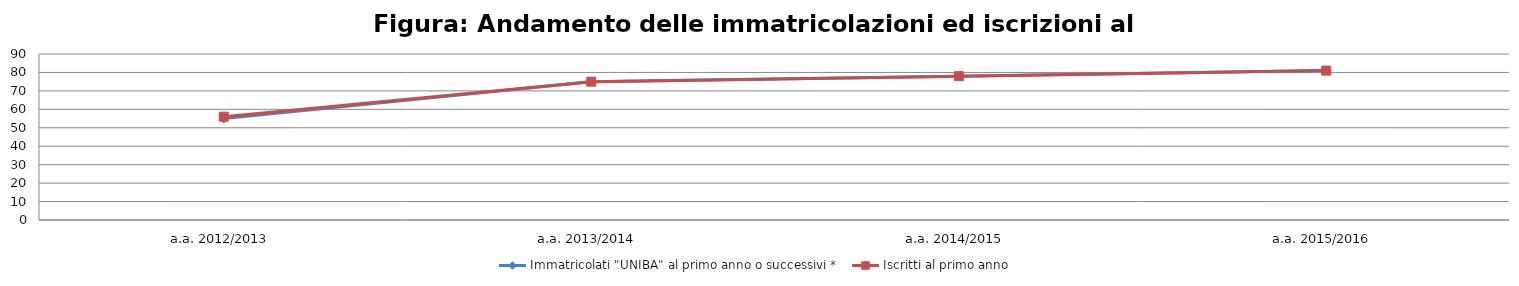
| Category | Immatricolati "UNIBA" al primo anno o successivi * | Iscritti al primo anno  |
|---|---|---|
| a.a. 2012/2013 | 55 | 56 |
| a.a. 2013/2014 | 75 | 75 |
| a.a. 2014/2015 | 78 | 78 |
| a.a. 2015/2016 | 81 | 81 |